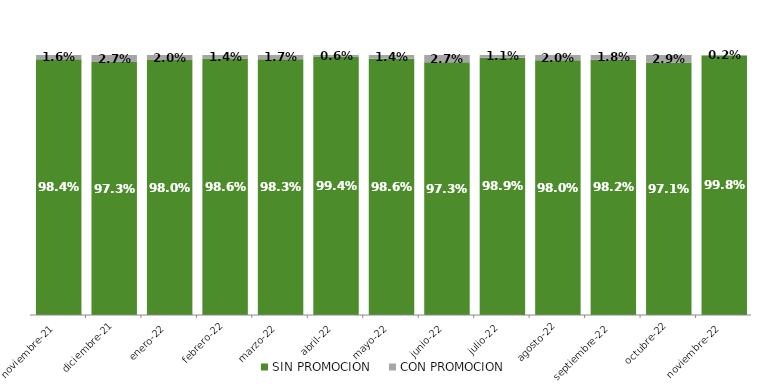
| Category | SIN PROMOCION   | CON PROMOCION   |
|---|---|---|
| 2021-11-01 | 0.984 | 0.016 |
| 2021-12-01 | 0.973 | 0.027 |
| 2022-01-01 | 0.98 | 0.02 |
| 2022-02-01 | 0.986 | 0.014 |
| 2022-03-01 | 0.983 | 0.017 |
| 2022-04-01 | 0.994 | 0.006 |
| 2022-05-01 | 0.986 | 0.014 |
| 2022-06-01 | 0.973 | 0.027 |
| 2022-07-01 | 0.989 | 0.011 |
| 2022-08-01 | 0.98 | 0.02 |
| 2022-09-01 | 0.982 | 0.018 |
| 2022-10-01 | 0.971 | 0.029 |
| 2022-11-01 | 0.998 | 0.002 |